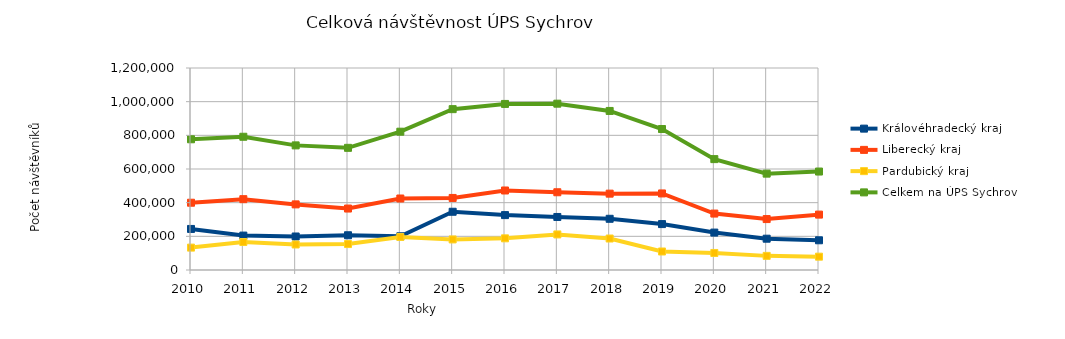
| Category | Královéhradecký kraj | Liberecký kraj | Pardubický kraj | Celkem na ÚPS Sychrov |
|---|---|---|---|---|
| 2010.0 | 243910 | 399672 | 133004 | 776586 |
| 2011.0 | 204481 | 420780 | 166238 | 791499 |
| 2012.0 | 199025 | 389781 | 151509 | 740315 |
| 2013.0 | 206419 | 365108 | 154165 | 725692 |
| 2014.0 | 200438 | 424718 | 196473 | 821629 |
| 2015.0 | 345970 | 428023 | 181567 | 955560 |
| 2016.0 | 326137 | 472318 | 188108 | 986563 |
| 2017.0 | 314983 | 461803 | 211268 | 988054 |
| 2018.0 | 304267 | 453568 | 187017 | 944852 |
| 2019.0 | 272720 | 454785 | 109949 | 837454 |
| 2020.0 | 222238 | 335261 | 101211 | 658710 |
| 2021.0 | 185934 | 302574 | 83925 | 572433 |
| 2022.0 | 176582 | 329071 | 79234 | 584887 |